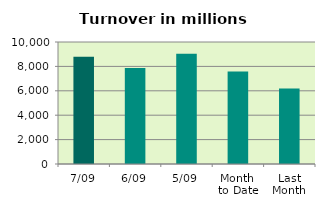
| Category | Series 0 |
|---|---|
| 7/09 | 8796.022 |
| 6/09 | 7867.458 |
| 5/09 | 9036.657 |
| Month 
to Date | 7576.59 |
| Last
Month | 6185.877 |